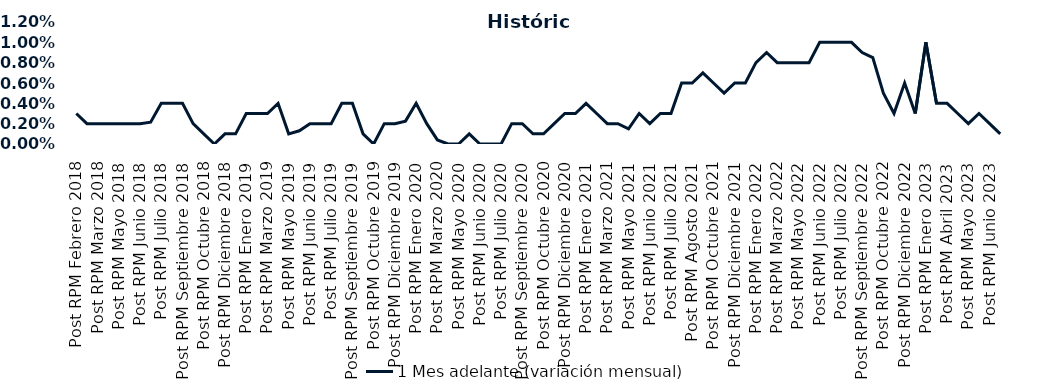
| Category | 1 Mes adelante (variación mensual) |
|---|---|
| Post RPM Febrero 2018 | 0.003 |
| Pre RPM Marzo 2018 | 0.002 |
| Post RPM Marzo 2018 | 0.002 |
| Pre RPM Mayo 2018 | 0.002 |
| Post RPM Mayo 2018 | 0.002 |
| Pre RPM Junio 2018 | 0.002 |
| Post RPM Junio 2018 | 0.002 |
| Pre RPM Julio 2018 | 0.002 |
| Post RPM Julio 2018 | 0.004 |
| Pre RPM Septiembre 2018 | 0.004 |
| Post RPM Septiembre 2018 | 0.004 |
| Pre RPM Octubre 2018 | 0.002 |
| Post RPM Octubre 2018 | 0.001 |
| Pre RPM Diciembre 2018 | 0 |
| Post RPM Diciembre 2018 | 0.001 |
| Pre RPM Enero 2019 | 0.001 |
| Post RPM Enero 2019 | 0.003 |
| Pre RPM Marzo 2019 | 0.003 |
| Post RPM Marzo 2019 | 0.003 |
| Pre RPM Mayo 2019 | 0.004 |
| Post RPM Mayo 2019 | 0.001 |
| Pre RPM Junio 2019 | 0.001 |
| Post RPM Junio 2019 | 0.002 |
| Pre RPM Julio 2019 | 0.002 |
| Post RPM Julio 2019 | 0.002 |
| Pre RPM Septiembre 2019 | 0.004 |
| Post RPM Septiembre 2019 | 0.004 |
| Pre RPM Octubre 2019 | 0.001 |
| Post RPM Octubre 2019 | 0 |
| Pre RPM Diciembre 2019 | 0.002 |
| Post RPM Diciembre 2019 | 0.002 |
| Pre RPM Enero 2020 | 0.002 |
| Post RPM Enero 2020 | 0.004 |
| Pre RPM Marzo 2020 | 0.002 |
| Post RPM Marzo 2020 | 0 |
| Pre RPM Mayo 2020 | 0 |
| Post RPM Mayo 2020 | 0 |
| Pre RPM Junio 2020 | 0.001 |
| Post RPM Junio 2020 | 0 |
| Pre RPM Julio 2020 | 0 |
| Post RPM Julio 2020 | 0 |
| Pre RPM Septiembre 2020 | 0.002 |
| Post RPM Septiembre 2020 | 0.002 |
| Pre RPM Octubre 2020 | 0.001 |
| Post RPM Octubre 2020 | 0.001 |
| Pre RPM Diciembre 2020 | 0.002 |
| Post RPM Diciembre 2020 | 0.003 |
| Pre RPM Enero 2021 | 0.003 |
| Post RPM Enero 2021 | 0.004 |
| Pre RPM Marzo 2021 | 0.003 |
| Post RPM Marzo 2021 | 0.002 |
| Pre RPM Mayo 2021 | 0.002 |
| Post RPM Mayo 2021 | 0.002 |
| Pre RPM Junio 2021 | 0.003 |
| Post RPM Junio 2021 | 0.002 |
| Pre RPM Julio 2021 | 0.003 |
| Post RPM Julio 2021 | 0.003 |
| Pre RPM Agosto 2021 | 0.006 |
| Post RPM Agosto 2021 | 0.006 |
| Pre RPM Octubre 2021 | 0.007 |
| Post RPM Octubre 2021 | 0.006 |
| Pre RPM Diciembre 2021 | 0.005 |
| Post RPM Diciembre 2021 | 0.006 |
| Pre RPM Enero 2022 | 0.006 |
| Post RPM Enero 2022 | 0.008 |
| Pre RPM Marzo 2022 | 0.009 |
| Post RPM Marzo 2022 | 0.008 |
| Pre RPM Mayo 2022 | 0.008 |
| Post RPM Mayo 2022 | 0.008 |
| Pre RPM Junio 2022 | 0.008 |
| Post RPM Junio 2022 | 0.01 |
| Pre RPM Julio 2022 | 0.01 |
| Post RPM Julio 2022 | 0.01 |
| Pre RPM Septiembre 2022 | 0.01 |
| Post RPM Septiembre 2022 | 0.009 |
| Pre RPM Octubre 2022 | 0.008 |
| Post RPM Octubre 2022 | 0.005 |
| Pre RPM Diciembre 2022 | 0.003 |
| Post RPM Diciembre 2022 | 0.006 |
| Pre RPM Enero 2023 | 0.003 |
| Post RPM Enero 2023 | 0.01 |
| Pre RPM Abril 2023 | 0.004 |
| Post RPM Abril 2023 | 0.004 |
| Pre RPM Mayo 2023 | 0.003 |
| Post RPM Mayo 2023 | 0.002 |
| Pre RPM Junio 2023 | 0.003 |
| Post RPM Junio 2023 | 0.002 |
| Pre RPM Julio 2023 | 0.001 |